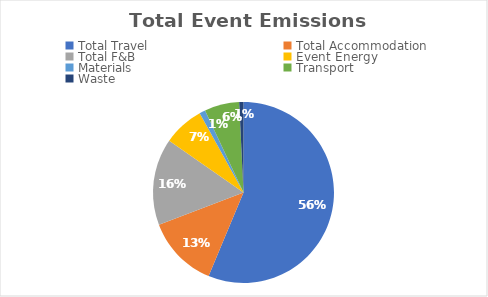
| Category | Series 0 |
|---|---|
| Total Travel | 3.71 |
| Total Accommodation | 0.85 |
| Total F&B | 1.02 |
| Event Energy | 0.48 |
| Materials | 0.07 |
| Transport | 0.41 |
| Waste | 0.05 |